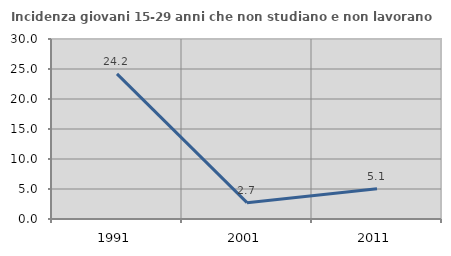
| Category | Incidenza giovani 15-29 anni che non studiano e non lavorano  |
|---|---|
| 1991.0 | 24.194 |
| 2001.0 | 2.724 |
| 2011.0 | 5.058 |